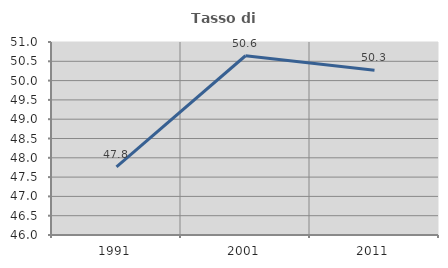
| Category | Tasso di occupazione   |
|---|---|
| 1991.0 | 47.767 |
| 2001.0 | 50.644 |
| 2011.0 | 50.266 |